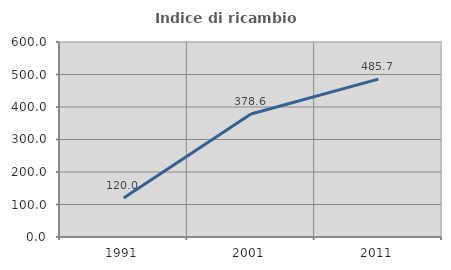
| Category | Indice di ricambio occupazionale  |
|---|---|
| 1991.0 | 120 |
| 2001.0 | 378.571 |
| 2011.0 | 485.714 |